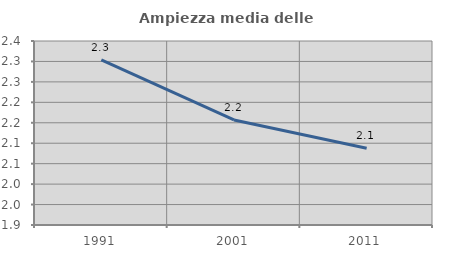
| Category | Ampiezza media delle famiglie |
|---|---|
| 1991.0 | 2.304 |
| 2001.0 | 2.157 |
| 2011.0 | 2.088 |